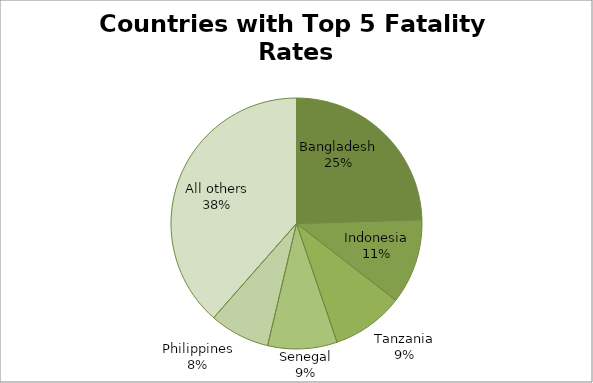
| Category | Sum of Dead and Missing (Min. Estimate) |
|---|---|
| Bangladesh | 5117 |
| Indonesia | 2281 |
| Tanzania | 1937 |
| Senegal | 1863 |
| Philippines | 1623 |
| All others | 8034 |